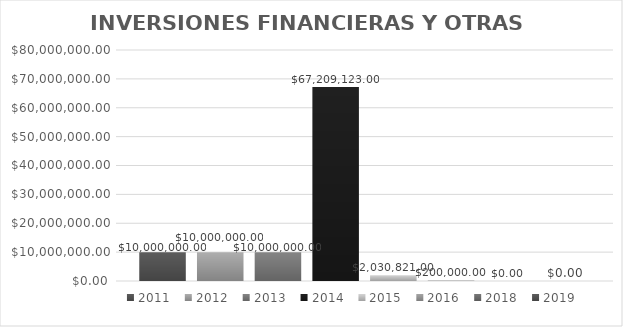
| Category | 2011 | 2012 | 2013 | 2014 | 2015 | 2016 | 2018 | 2019 |
|---|---|---|---|---|---|---|---|---|
| 0 | 10000000 | 10000000 | 10000000 | 67209123 | 2030821 | 200000 | 0 | 0 |